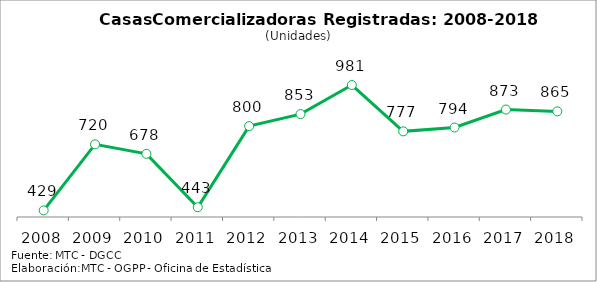
| Category | Series 0 |
|---|---|
| 2008.0 | 429 |
| 2009.0 | 720 |
| 2010.0 | 678 |
| 2011.0 | 443 |
| 2012.0 | 800 |
| 2013.0 | 853 |
| 2014.0 | 981 |
| 2015.0 | 777 |
| 2016.0 | 794 |
| 2017.0 | 873 |
| 2018.0 | 865 |